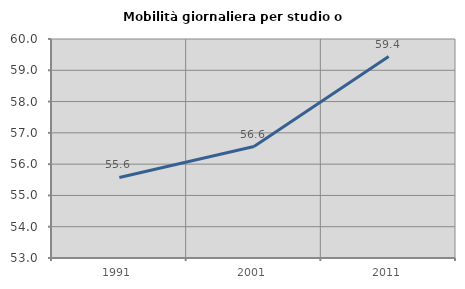
| Category | Mobilità giornaliera per studio o lavoro |
|---|---|
| 1991.0 | 55.575 |
| 2001.0 | 56.561 |
| 2011.0 | 59.439 |